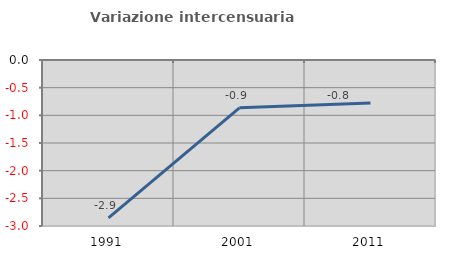
| Category | Variazione intercensuaria annua |
|---|---|
| 1991.0 | -2.852 |
| 2001.0 | -0.864 |
| 2011.0 | -0.777 |